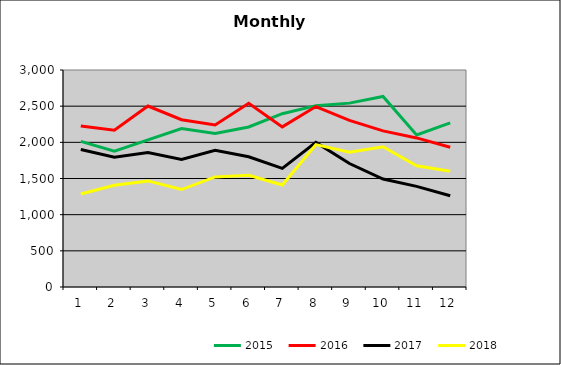
| Category | 2015 | 2016 | 2017 | 2018 |
|---|---|---|---|---|
| 0 | 2012.541 | 2226.188 | 1900.859 | 1286.21 |
| 1 | 1876.319 | 2166.497 | 1795.105 | 1406.556 |
| 2 | 2033.639 | 2501.903 | 1859.386 | 1466.695 |
| 3 | 2190.038 | 2312.349 | 1764.013 | 1347.408 |
| 4 | 2122.18 | 2240.561 | 1891.399 | 1522.181 |
| 5 | 2212.445 | 2540.235 | 1800.236 | 1543.945 |
| 6 | 2396.234 | 2213.485 | 1640.121 | 1409.491 |
| 7 | 2507.021 | 2494.361 | 1999.331 | 1969.207 |
| 8 | 2542.091 | 2304.009 | 1706.874 | 1861.88 |
| 9 | 2633.621 | 2158.544 | 1492.036 | 1938.743 |
| 10 | 2103.155 | 2060.966 | 1390.86 | 1676.82 |
| 11 | 2268.667 | 1932.97 | 1261.902 | 1598.863 |